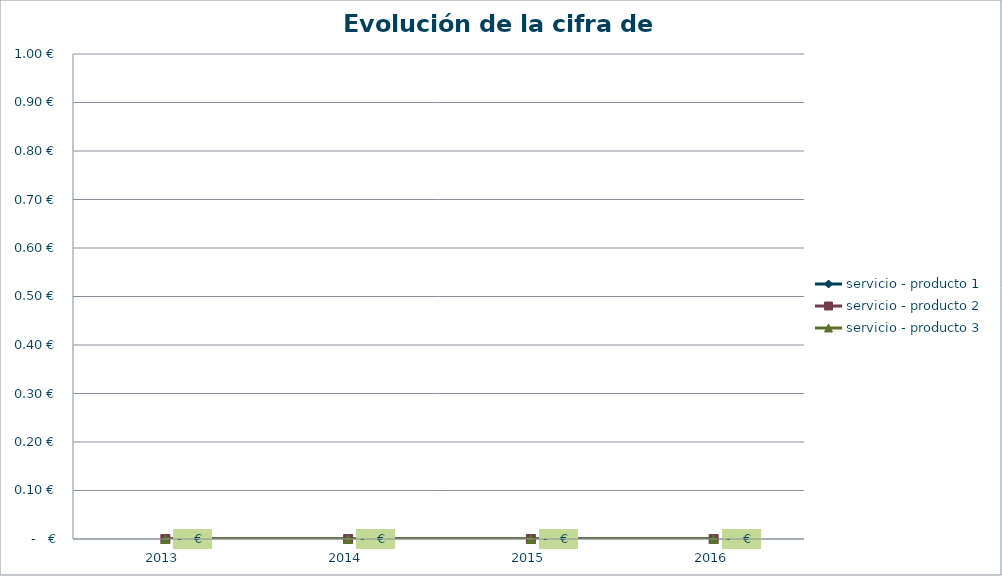
| Category | servicio - producto 1 | servicio - producto 2 | servicio - producto 3 |
|---|---|---|---|
| 2013.0 | 0 | 0 | 0 |
| 2014.0 | 0 | 0 | 0 |
| 2015.0 | 0 | 0 | 0 |
| 2016.0 | 0 | 0 | 0 |